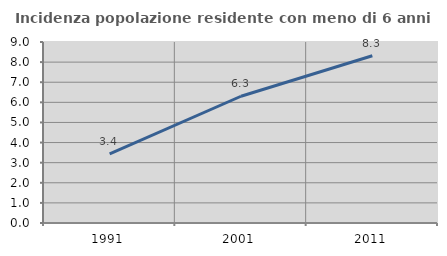
| Category | Incidenza popolazione residente con meno di 6 anni |
|---|---|
| 1991.0 | 3.431 |
| 2001.0 | 6.303 |
| 2011.0 | 8.319 |